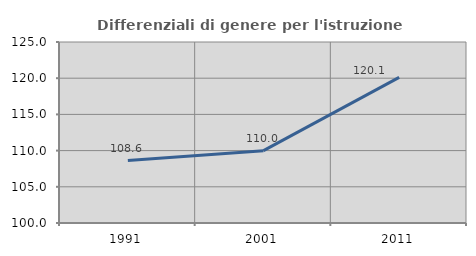
| Category | Differenziali di genere per l'istruzione superiore |
|---|---|
| 1991.0 | 108.629 |
| 2001.0 | 109.992 |
| 2011.0 | 120.119 |